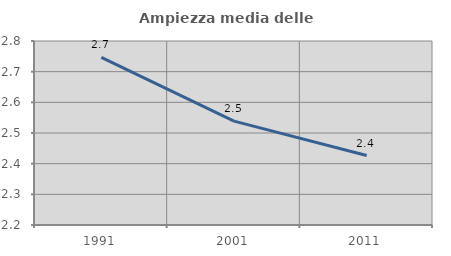
| Category | Ampiezza media delle famiglie |
|---|---|
| 1991.0 | 2.746 |
| 2001.0 | 2.539 |
| 2011.0 | 2.426 |